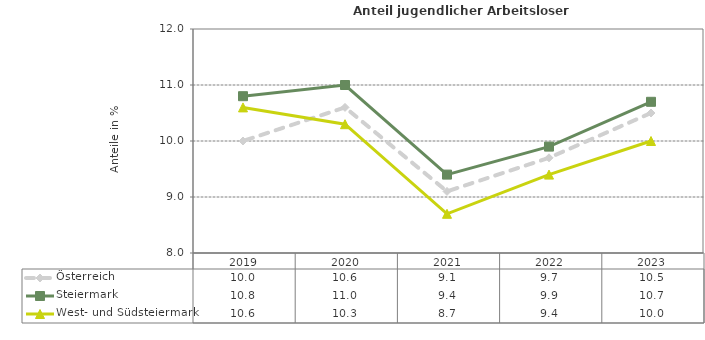
| Category | Österreich | Steiermark | West- und Südsteiermark |
|---|---|---|---|
| 2023.0 | 10.5 | 10.7 | 10 |
| 2022.0 | 9.7 | 9.9 | 9.4 |
| 2021.0 | 9.1 | 9.4 | 8.7 |
| 2020.0 | 10.6 | 11 | 10.3 |
| 2019.0 | 10 | 10.8 | 10.6 |